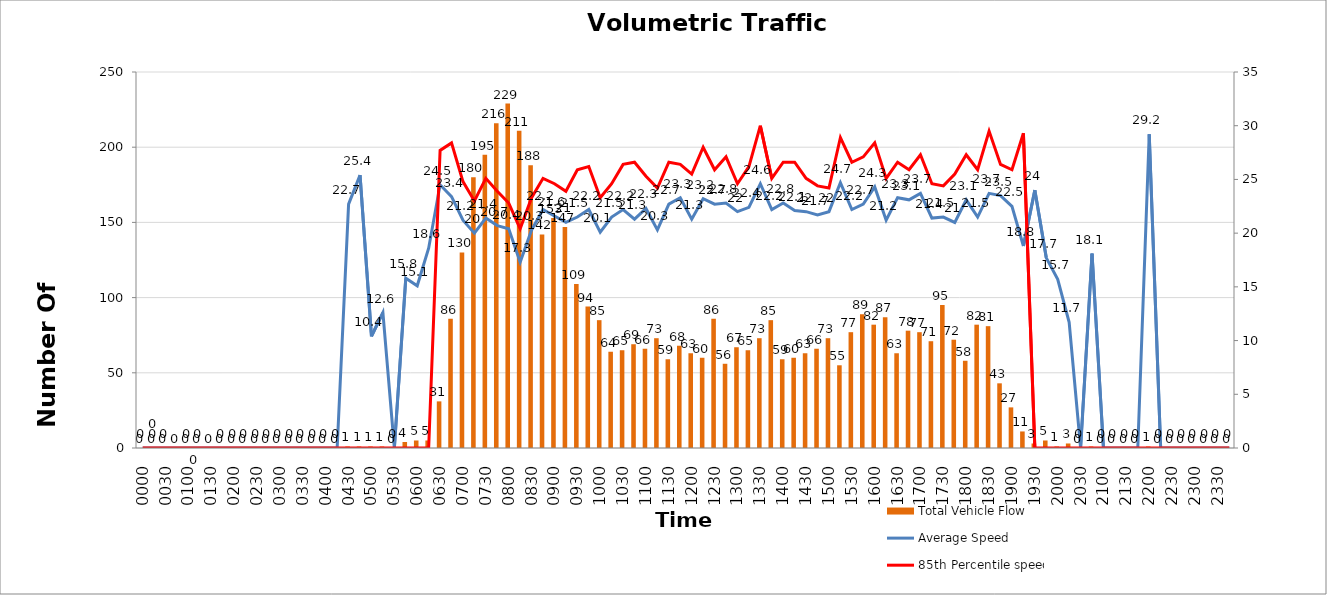
| Category | Total Vehicle Flow |
|---|---|
| 0000 | 0 |
| 0015 | 0 |
| 0030 | 0 |
| 0045 | 0 |
| 0100 | 0 |
| 0115 | 0 |
| 0130 | 0 |
| 0145 | 0 |
| 0200 | 0 |
| 0215 | 0 |
| 0230 | 0 |
| 0245 | 0 |
| 0300 | 0 |
| 0315 | 0 |
| 0330 | 0 |
| 0345 | 0 |
| 0400 | 0 |
| 0415 | 0 |
| 0430 | 1 |
| 0445 | 1 |
| 0500 | 1 |
| 0515 | 1 |
| 0530 | 0 |
| 0545 | 4 |
| 0600 | 5 |
| 0615 | 5 |
| 0630 | 31 |
| 0645 | 86 |
| 0700 | 130 |
| 0715 | 180 |
| 0730 | 195 |
| 0745 | 216 |
| 0800 | 229 |
| 0815 | 211 |
| 0830 | 188 |
| 0845 | 142 |
| 0900 | 153 |
| 0915 | 147 |
| 0930 | 109 |
| 0945 | 94 |
| 1000 | 85 |
| 1015 | 64 |
| 1030 | 65 |
| 1045 | 69 |
| 1100 | 66 |
| 1115 | 73 |
| 1130 | 59 |
| 1145 | 68 |
| 1200 | 63 |
| 1215 | 60 |
| 1230 | 86 |
| 1245 | 56 |
| 1300 | 67 |
| 1315 | 65 |
| 1330 | 73 |
| 1345 | 85 |
| 1400 | 59 |
| 1415 | 60 |
| 1430 | 63 |
| 1445 | 66 |
| 1500 | 73 |
| 1515 | 55 |
| 1530 | 77 |
| 1545 | 89 |
| 1600 | 82 |
| 1615 | 87 |
| 1630 | 63 |
| 1645 | 78 |
| 1700 | 77 |
| 1715 | 71 |
| 1730 | 95 |
| 1745 | 72 |
| 1800 | 58 |
| 1815 | 82 |
| 1830 | 81 |
| 1845 | 43 |
| 1900 | 27 |
| 1915 | 11 |
| 1930 | 3 |
| 1945 | 5 |
| 2000 | 1 |
| 2015 | 3 |
| 2030 | 0 |
| 2045 | 1 |
| 2100 | 0 |
| 2115 | 0 |
| 2130 | 0 |
| 2145 | 0 |
| 2200 | 1 |
| 2215 | 0 |
| 2230 | 0 |
| 2245 | 0 |
| 2300 | 0 |
| 2315 | 0 |
| 2330 | 0 |
| 2345 | 0 |